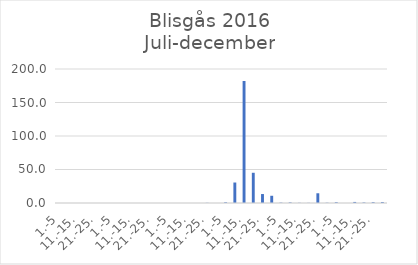
| Category | Series 0 |
|---|---|
| 1.-5 | 0 |
| 6.-10. | 0 |
| 11.-15. | 0 |
| 16.-20. | 0 |
| 21.-25. | 0 |
| 26.-31. | 0 |
| 1.-5 | 0 |
| 6.-10. | 0 |
| 11.-15. | 0 |
| 16.-20. | 0 |
| 21.-25. | 0 |
| 26.-31. | 0 |
| 1.-5 | 0 |
| 6.-10. | 0 |
| 11.-15. | 0 |
| 16.-20. | 0 |
| 21.-25. | 0.256 |
| 26.-30. | 0 |
| 1.-5 | 1.064 |
| 6.-10. | 30.576 |
| 11.-15. | 182.111 |
| 16.-20. | 45.118 |
| 21.-25. | 13.369 |
| 26.-31. | 10.791 |
| 1.-5 | 0.549 |
| 6.-10. | 0.868 |
| 11.-15. | 0.289 |
| 16.-20. | 0.226 |
| 21.-25. | 14.524 |
| 26.-30. | 0.4 |
| 1.-5 | 1.154 |
| 6.-10. | 0 |
| 11.-15. | 1.578 |
| 16.-20. | 0.77 |
| 21.-25. | 1.212 |
| 26.-31. | 1.416 |